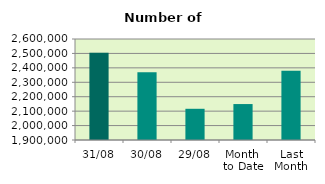
| Category | Series 0 |
|---|---|
| 31/08 | 2505372 |
| 30/08 | 2369708 |
| 29/08 | 2116296 |
| Month 
to Date | 2149140 |
| Last
Month | 2380266.19 |